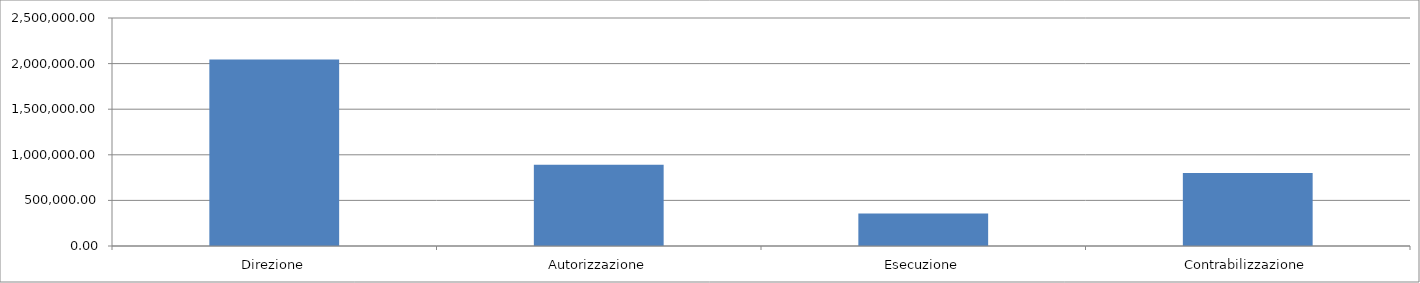
| Category | Series 0 |
|---|---|
| Direzione | 2046157.415 |
| Autorizzazione | 889633.659 |
| Esecuzione | 355853.463 |
| Contrabilizzazione | 800670.293 |